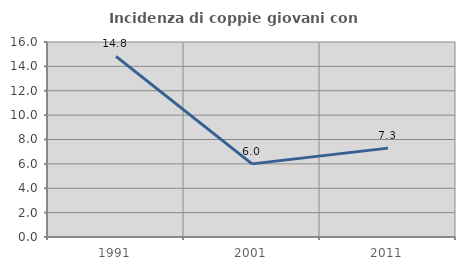
| Category | Incidenza di coppie giovani con figli |
|---|---|
| 1991.0 | 14.815 |
| 2001.0 | 6 |
| 2011.0 | 7.292 |